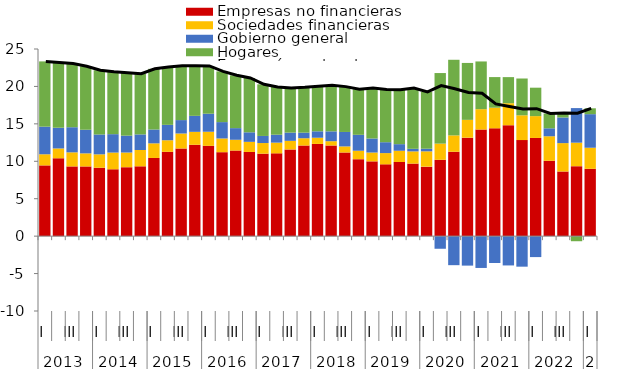
| Category | Empresas no financieras | Sociedades financieras | Gobierno general | Hogares |
|---|---|---|---|---|
| 0 | 9.452 | 1.485 | 3.69 | 8.716 |
| 1 | 10.403 | 1.311 | 2.752 | 8.745 |
| 2 | 9.315 | 1.88 | 3.356 | 8.502 |
| 3 | 9.312 | 1.747 | 3.155 | 8.488 |
| 4 | 9.139 | 1.79 | 2.653 | 8.574 |
| 5 | 8.934 | 2.232 | 2.458 | 8.328 |
| 6 | 9.21 | 1.962 | 2.251 | 8.413 |
| 7 | 9.33 | 2.176 | 2.084 | 8.119 |
| 8 | 10.443 | 1.954 | 1.849 | 8.107 |
| 9 | 11.265 | 1.545 | 2.057 | 7.729 |
| 10 | 11.712 | 2 | 1.791 | 7.274 |
| 11 | 12.207 | 1.726 | 2.137 | 6.708 |
| 12 | 12.067 | 1.879 | 2.41 | 6.376 |
| 13 | 11.215 | 1.835 | 2.184 | 6.773 |
| 14 | 11.435 | 1.439 | 1.555 | 7.058 |
| 15 | 11.245 | 1.352 | 1.274 | 7.256 |
| 16 | 11.02 | 1.417 | 0.948 | 6.897 |
| 17 | 11.058 | 1.434 | 1.058 | 6.38 |
| 18 | 11.582 | 1.148 | 1.1 | 5.973 |
| 19 | 12.106 | 0.972 | 0.747 | 6.05 |
| 20 | 12.317 | 0.83 | 0.858 | 6.011 |
| 21 | 12.109 | 0.575 | 1.317 | 6.167 |
| 22 | 11.176 | 0.81 | 1.93 | 6.058 |
| 23 | 10.282 | 1.129 | 2.126 | 6.097 |
| 24 | 9.991 | 1.18 | 1.875 | 6.729 |
| 25 | 9.593 | 1.504 | 1.455 | 7.036 |
| 26 | 9.905 | 1.502 | 0.881 | 7.277 |
| 27 | 9.694 | 1.628 | 0.345 | 8.125 |
| 28 | 9.285 | 2.044 | 0.35 | 7.583 |
| 29 | 10.198 | 2.16 | -1.685 | 9.43 |
| 30 | 11.273 | 2.184 | -3.878 | 10.104 |
| 31 | 13.154 | 2.381 | -3.937 | 7.603 |
| 32 | 14.24 | 2.723 | -4.249 | 6.374 |
| 33 | 14.404 | 2.755 | -3.587 | 4.089 |
| 34 | 14.815 | 2.944 | -3.913 | 3.484 |
| 35 | 12.834 | 3.308 | -4.078 | 4.917 |
| 36 | 13.116 | 2.917 | -2.799 | 3.799 |
| 37 | 10.068 | 3.275 | 1.063 | 1.983 |
| 38 | 8.636 | 3.792 | 3.425 | 0.61 |
| 39 | 9.345 | 3.142 | 4.619 | -0.679 |
| 40 | 8.997 | 2.815 | 4.482 | 0.784 |